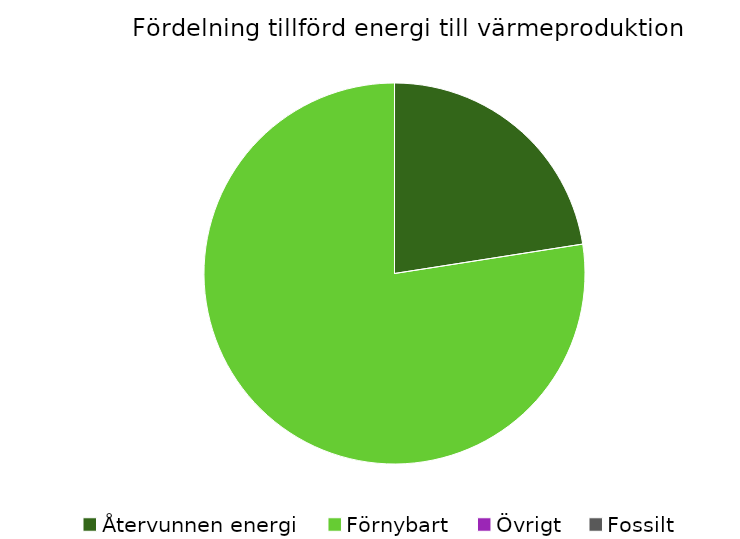
| Category | Fördelning värmeproduktion |
|---|---|
| Återvunnen energi | 0.225 |
| Förnybart | 0.775 |
| Övrigt | 0 |
| Fossilt | 0 |